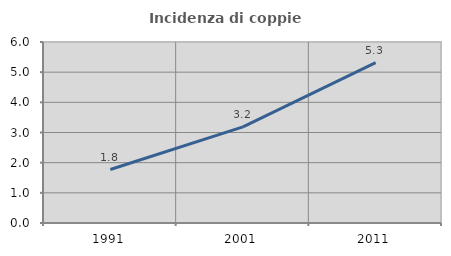
| Category | Incidenza di coppie miste |
|---|---|
| 1991.0 | 1.772 |
| 2001.0 | 3.185 |
| 2011.0 | 5.316 |